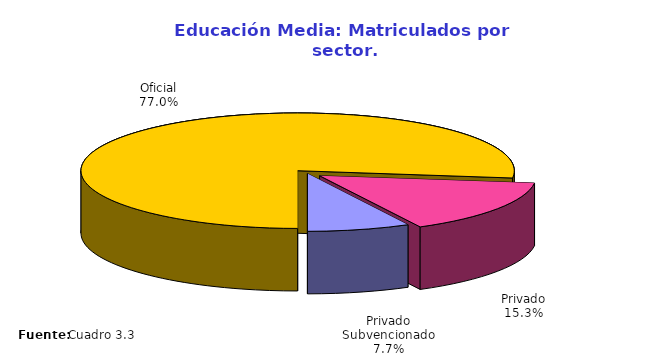
| Category | Series 0 |
|---|---|
| Oficial | 194610 |
| Privado | 38670 |
| Privado Subvencionado | 19406 |